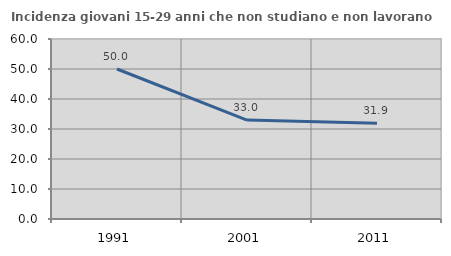
| Category | Incidenza giovani 15-29 anni che non studiano e non lavorano  |
|---|---|
| 1991.0 | 50 |
| 2001.0 | 32.984 |
| 2011.0 | 31.902 |